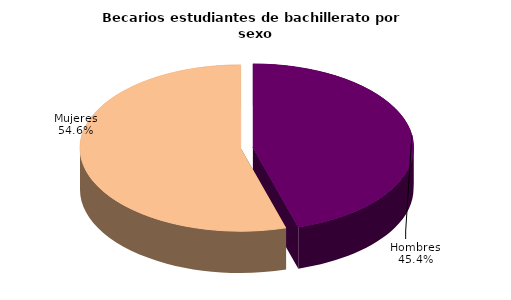
| Category | Series 0 |
|---|---|
| Hombres | 33055 |
| Mujeres | 39693 |